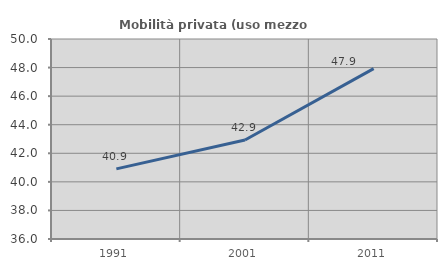
| Category | Mobilità privata (uso mezzo privato) |
|---|---|
| 1991.0 | 40.909 |
| 2001.0 | 42.932 |
| 2011.0 | 47.929 |